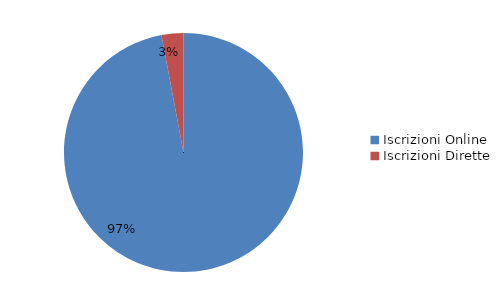
| Category | Series 0 |
|---|---|
| Iscrizioni Online | 114062 |
| Iscrizioni Dirette | 3481 |